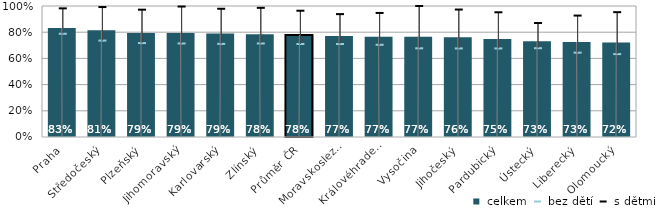
| Category |  celkem |
|---|---|
|   Praha | 0.832 |
|   Středočeský | 0.814 |
|   Plzeňský | 0.793 |
|   Jihomoravský | 0.793 |
|   Karlovarský | 0.79 |
|   Zlínský | 0.784 |
| Průměr ČR | 0.779 |
|   Moravskoslezský | 0.771 |
|   Královéhradecký | 0.766 |
|   Vysočina | 0.766 |
|   Jihočeský | 0.761 |
|   Pardubický | 0.749 |
|   Ústecký | 0.73 |
|   Liberecký | 0.725 |
|   Olomoucký | 0.721 |